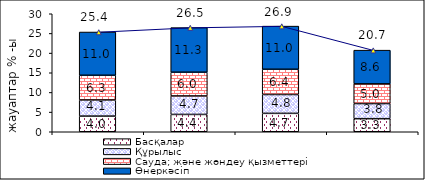
| Category | Басқалар | Құрылыс | Сауда; және жөндеу қызметтері | Өнеркәсіп |
|---|---|---|---|---|
| 0 | 3.978 | 4.102 | 6.277 | 11.001 |
| 1 | 4.403 | 4.704 | 6.031 | 11.339 |
| 2 | 4.676 | 4.796 | 6.415 | 10.971 |
| 3 | 3.322 | 3.846 | 5.012 | 8.566 |